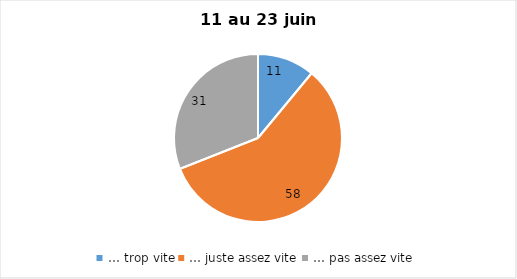
| Category | Series 0 |
|---|---|
| … trop vite | 11 |
| … juste assez vite | 58 |
| … pas assez vite | 31 |